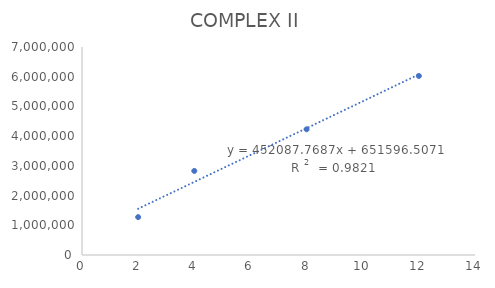
| Category | Series 0 |
|---|---|
| 8.0 | 4229978.462 |
| 4.0 | 2829736 |
| 2.0 | 1275269.388 |
| 12.0 | 6025684.164 |